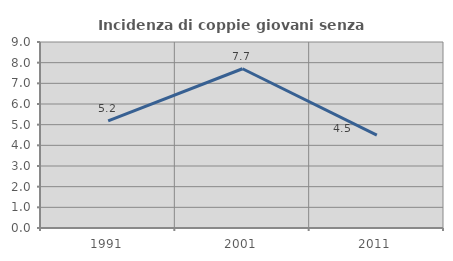
| Category | Incidenza di coppie giovani senza figli |
|---|---|
| 1991.0 | 5.179 |
| 2001.0 | 7.705 |
| 2011.0 | 4.491 |